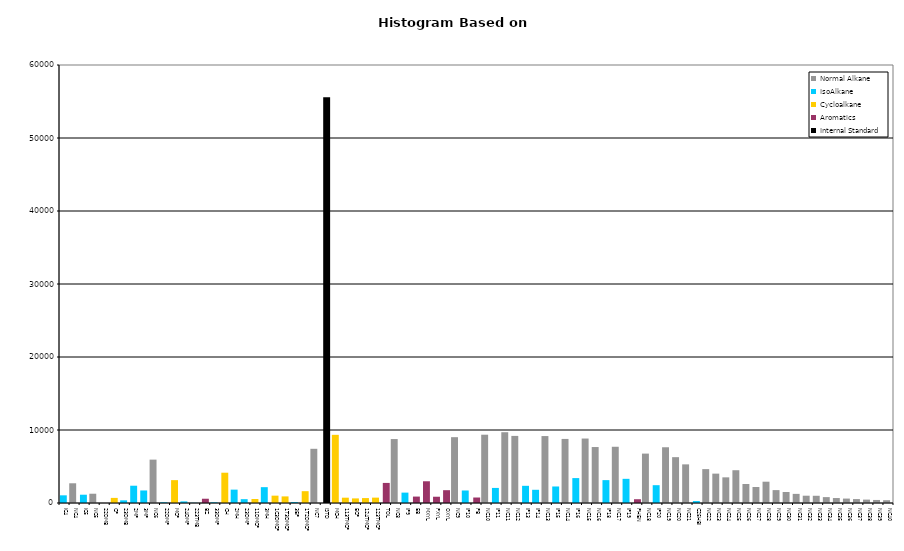
| Category | Normal Alkane | IsoAlkane | Cycloalkane | Aromatics | Internal Standard |
|---|---|---|---|---|---|
| IC4 | 0 | 1051 | 0 | 0 | 0 |
| NC4 | 2702 | 0 | 0 | 0 | 0 |
| IC5 | 0 | 1135 | 0 | 0 | 0 |
| NC5 | 1271 | 0 | 0 | 0 | 0 |
| 22DMB | 0 | 0 | 0 | 0 | 0 |
| CP | 0 | 0 | 699 | 0 | 0 |
| 23DMB | 0 | 366 | 0 | 0 | 0 |
| 2MP | 0 | 2367 | 0 | 0 | 0 |
| 3MP | 0 | 1718 | 0 | 0 | 0 |
| NC6 | 5941 | 0 | 0 | 0 | 0 |
| 22DMP | 0 | 95 | 0 | 0 | 0 |
| MCP | 0 | 0 | 3132 | 0 | 0 |
| 24DMP | 0 | 220 | 0 | 0 | 0 |
| 223TMB | 0 | 28 | 0 | 0 | 0 |
| BZ | 0 | 0 | 0 | 584 | 0 |
| 33DMP | 0 | 92 | 0 | 0 | 0 |
| CH | 0 | 0 | 4149 | 0 | 0 |
| 2MH | 0 | 1831 | 0 | 0 | 0 |
| 23DMP | 0 | 525 | 0 | 0 | 0 |
| 11DMCP | 0 | 0 | 548 | 0 | 0 |
| 3MH | 0 | 2170 | 0 | 0 | 0 |
| 1C3DMCP | 0 | 0 | 1006 | 0 | 0 |
| 1T3DMCP | 0 | 0 | 904 | 0 | 0 |
| 3EP | 0 | 128 | 0 | 0 | 0 |
| 1T2DMCP | 0 | 0 | 1620 | 0 | 0 |
| NC7 | 7425 | 0 | 0 | 0 | 0 |
| ISTD | 0 | 0 | 0 | 0 | 55597 |
| MCH | 0 | 0 | 9338 | 0 | 0 |
| 113TMCP | 0 | 0 | 728 | 0 | 0 |
| ECP | 0 | 0 | 630 | 0 | 0 |
| 124TMCP | 0 | 0 | 674 | 0 | 0 |
| 123TMCP | 0 | 0 | 736 | 0 | 0 |
| TOL | 0 | 0 | 0 | 2751 | 0 |
| NC8 | 8759 | 0 | 0 | 0 | 0 |
| IP9 | 0 | 1422 | 0 | 0 | 0 |
| EB | 0 | 0 | 0 | 880 | 0 |
| MXYL | 0 | 0 | 0 | 2977 | 0 |
| PXYL | 0 | 0 | 0 | 859 | 0 |
| OXYL | 0 | 0 | 0 | 1755 | 0 |
| NC9 | 9017 | 0 | 0 | 0 | 0 |
| IP10 | 0 | 1715 | 0 | 0 | 0 |
| PB | 0 | 0 | 0 | 752 | 0 |
| NC10 | 9355 | 0 | 0 | 0 | 0 |
| IP11 | 0 | 2065 | 0 | 0 | 0 |
| NC11 | 9696 | 0 | 0 | 0 | 0 |
| NC12 | 9191 | 0 | 0 | 0 | 0 |
| IP13 | 0 | 2354 | 0 | 0 | 0 |
| IP14 | 0 | 1810 | 0 | 0 | 0 |
| NC13 | 9170 | 0 | 0 | 0 | 0 |
| IP15 | 0 | 2263 | 0 | 0 | 0 |
| NC14 | 8777 | 0 | 0 | 0 | 0 |
| IP16 | 0 | 3412 | 0 | 0 | 0 |
| NC15 | 8831 | 0 | 0 | 0 | 0 |
| NC16 | 7667 | 0 | 0 | 0 | 0 |
| IP18 | 0 | 3133 | 0 | 0 | 0 |
| NC17 | 7703 | 0 | 0 | 0 | 0 |
| IP19 | 0 | 3311 | 0 | 0 | 0 |
| PHEN | 0 | 0 | 0 | 517 | 0 |
| NC18 | 6767 | 0 | 0 | 0 | 0 |
| IP20 | 0 | 2440 | 0 | 0 | 0 |
| NC19 | 7636 | 0 | 0 | 0 | 0 |
| NC20 | 6279 | 0 | 0 | 0 | 0 |
| NC21 | 5292 | 0 | 0 | 0 | 0 |
| C25HBI | 0 | 266 | 0 | 0 | 0 |
| NC22 | 4641 | 0 | 0 | 0 | 0 |
| NC23 | 4023 | 0 | 0 | 0 | 0 |
| NC24 | 3514 | 0 | 0 | 0 | 0 |
| NC25 | 4491 | 0 | 0 | 0 | 0 |
| NC26 | 2604 | 0 | 0 | 0 | 0 |
| NC27 | 2189 | 0 | 0 | 0 | 0 |
| NC28 | 2919 | 0 | 0 | 0 | 0 |
| NC29 | 1766 | 0 | 0 | 0 | 0 |
| NC30 | 1510 | 0 | 0 | 0 | 0 |
| NC31 | 1250 | 0 | 0 | 0 | 0 |
| NC32 | 999 | 0 | 0 | 0 | 0 |
| NC33 | 990 | 0 | 0 | 0 | 0 |
| NC34 | 806 | 0 | 0 | 0 | 0 |
| NC35 | 680 | 0 | 0 | 0 | 0 |
| NC36 | 606 | 0 | 0 | 0 | 0 |
| NC37 | 538 | 0 | 0 | 0 | 0 |
| NC38 | 464 | 0 | 0 | 0 | 0 |
| NC39 | 416 | 0 | 0 | 0 | 0 |
| NC40 | 383 | 0 | 0 | 0 | 0 |